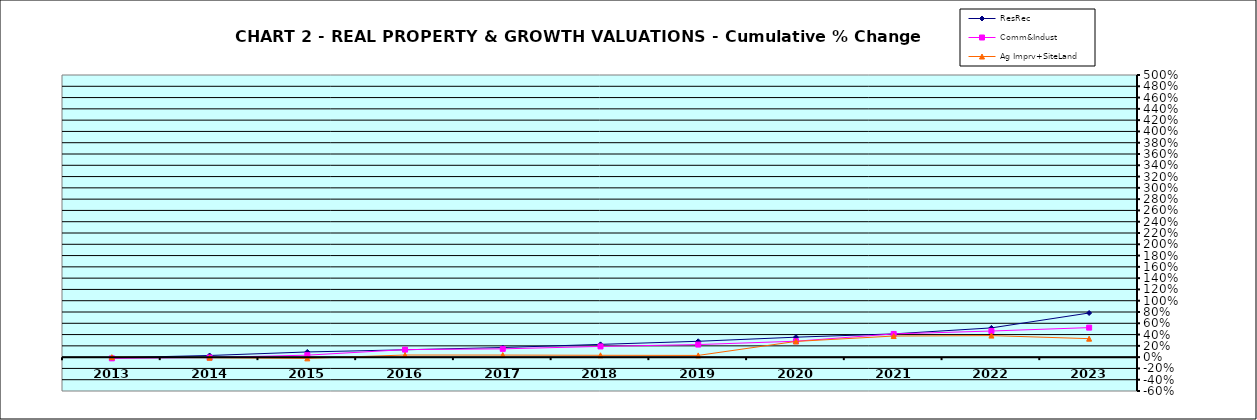
| Category | ResRec | Comm&Indust | Ag Imprv+SiteLand |
|---|---|---|---|
| 2013.0 | -0.011 | -0.021 | 0 |
| 2014.0 | 0.029 | -0.006 | -0.01 |
| 2015.0 | 0.092 | 0.035 | -0.022 |
| 2016.0 | 0.13 | 0.134 | 0.038 |
| 2017.0 | 0.17 | 0.147 | 0.037 |
| 2018.0 | 0.227 | 0.19 | 0.033 |
| 2019.0 | 0.281 | 0.223 | 0.031 |
| 2020.0 | 0.354 | 0.282 | 0.279 |
| 2021.0 | 0.412 | 0.411 | 0.374 |
| 2022.0 | 0.518 | 0.463 | 0.382 |
| 2023.0 | 0.782 | 0.523 | 0.328 |